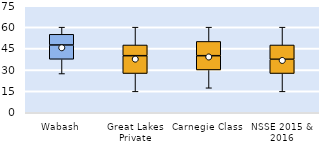
| Category | 25th | 50th | 75th |
|---|---|---|---|
| Wabash | 37.5 | 10 | 7.5 |
| Great Lakes Private | 27.5 | 12.5 | 7.5 |
| Carnegie Class | 30 | 10 | 10 |
| NSSE 2015 & 2016 | 27.5 | 10 | 10 |